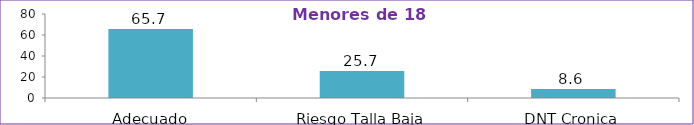
| Category | Series 0 |
|---|---|
| Adecuado | 65.7 |
| Riesgo Talla Baja | 25.7 |
| DNT Cronica | 8.6 |